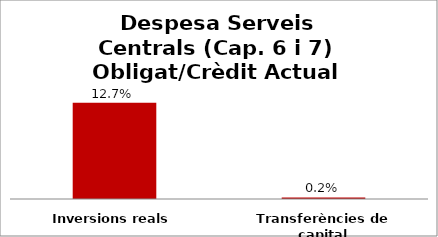
| Category | Series 0 |
|---|---|
| Inversions reals | 0.127 |
| Transferències de capital | 0.002 |